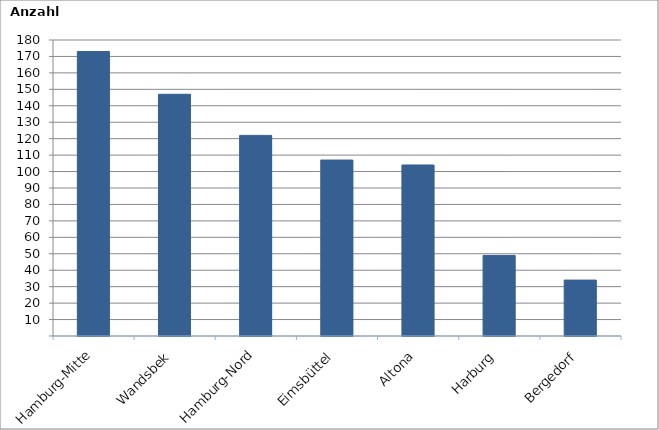
| Category | Series 0 |
|---|---|
| Hamburg-Mitte | 173 |
| Wandsbek | 147 |
| Hamburg-Nord | 122 |
| Eimsbüttel | 107 |
| Altona | 104 |
| Harburg | 49 |
| Bergedorf | 34 |